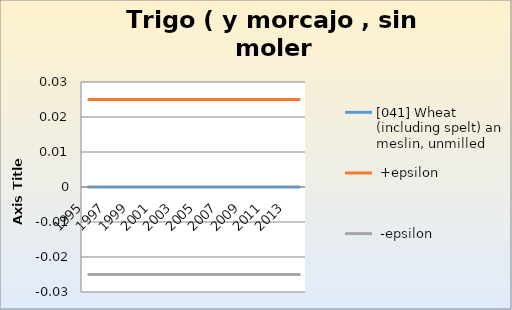
| Category | [041] Wheat (including spelt) and meslin, unmilled |  +epsilon |  -epsilon |
|---|---|---|---|
| 1995.0 | 0 | 0.025 | -0.025 |
| 1996.0 | 0 | 0.025 | -0.025 |
| 1997.0 | 0 | 0.025 | -0.025 |
| 1998.0 | 0 | 0.025 | -0.025 |
| 1999.0 | 0 | 0.025 | -0.025 |
| 2000.0 | 0 | 0.025 | -0.025 |
| 2001.0 | 0 | 0.025 | -0.025 |
| 2002.0 | 0 | 0.025 | -0.025 |
| 2003.0 | 0 | 0.025 | -0.025 |
| 2004.0 | 0 | 0.025 | -0.025 |
| 2005.0 | 0 | 0.025 | -0.025 |
| 2006.0 | 0 | 0.025 | -0.025 |
| 2007.0 | 0 | 0.025 | -0.025 |
| 2008.0 | 0 | 0.025 | -0.025 |
| 2009.0 | 0 | 0.025 | -0.025 |
| 2010.0 | 0 | 0.025 | -0.025 |
| 2011.0 | 0 | 0.025 | -0.025 |
| 2012.0 | 0 | 0.025 | -0.025 |
| 2013.0 | 0 | 0.025 | -0.025 |
| 2014.0 | 0 | 0.025 | -0.025 |